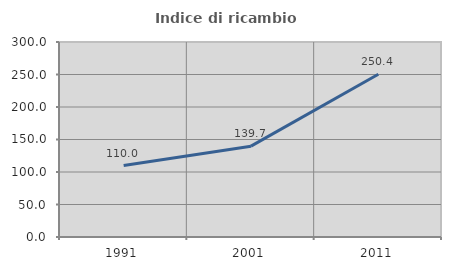
| Category | Indice di ricambio occupazionale  |
|---|---|
| 1991.0 | 109.97 |
| 2001.0 | 139.723 |
| 2011.0 | 250.399 |